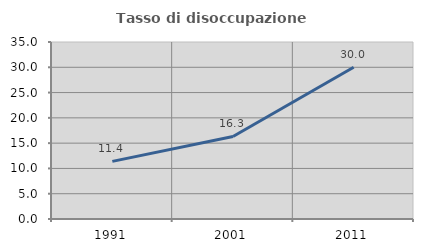
| Category | Tasso di disoccupazione giovanile  |
|---|---|
| 1991.0 | 11.392 |
| 2001.0 | 16.327 |
| 2011.0 | 30 |